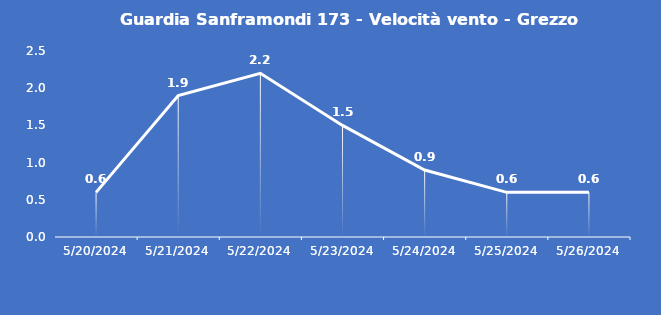
| Category | Guardia Sanframondi 173 - Velocità vento - Grezzo (m/s) |
|---|---|
| 5/20/24 | 0.6 |
| 5/21/24 | 1.9 |
| 5/22/24 | 2.2 |
| 5/23/24 | 1.5 |
| 5/24/24 | 0.9 |
| 5/25/24 | 0.6 |
| 5/26/24 | 0.6 |